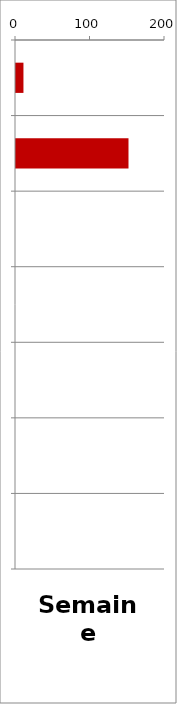
| Category | PL |
|---|---|
| 0 | 10 |
| 1 | 151 |
| 2 | 0 |
| 3 | 0 |
| 4 | 0 |
| 5 | 0 |
| 6 | 0 |